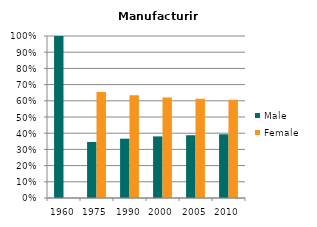
| Category | Male | Female |
|---|---|---|
| 1960.0 | 1 | 0 |
| 1975.0 | 0.346 | 0.654 |
| 1990.0 | 0.366 | 0.634 |
| 2000.0 | 0.38 | 0.62 |
| 2005.0 | 0.387 | 0.613 |
| 2010.0 | 0.393 | 0.607 |